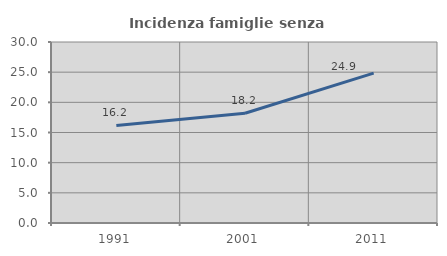
| Category | Incidenza famiglie senza nuclei |
|---|---|
| 1991.0 | 16.176 |
| 2001.0 | 18.196 |
| 2011.0 | 24.852 |